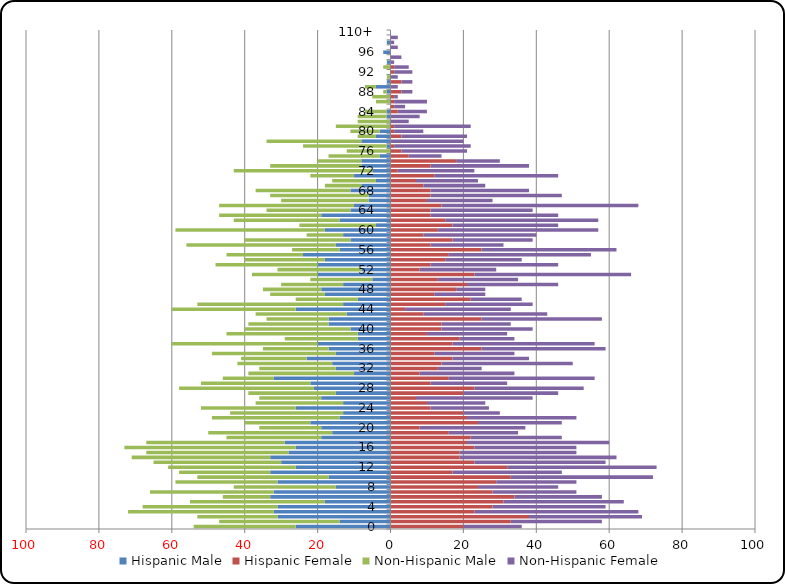
| Category | Hispanic Male | Hispanic Female | Non-Hispanic Male | Non-Hispanic Female |
|---|---|---|---|---|
| 0 | -26 | 20 | -28 | 16 |
| 1 | -14 | 33 | -33 | 25 |
| 2 | -31 | 38 | -22 | 31 |
| 3 | -32 | 23 | -40 | 45 |
| 4 | -31 | 28 | -37 | 31 |
| 5 | -18 | 31 | -37 | 33 |
| 6 | -33 | 34 | -13 | 24 |
| 7 | -32 | 28 | -34 | 23 |
| 8 | -15 | 24 | -28 | 22 |
| 9 | -31 | 29 | -28 | 22 |
| 10 | -17 | 33 | -36 | 39 |
| 11 | -33 | 17 | -25 | 30 |
| 12 | -26 | 32 | -35 | 41 |
| 13 | -30 | 23 | -35 | 36 |
| 14 | -33 | 19 | -38 | 43 |
| 15 | -28 | 19 | -39 | 32 |
| 16 | -26 | 23 | -47 | 28 |
| 17 | -29 | 21 | -38 | 39 |
| 18 | -19 | 22 | -26 | 25 |
| 19 | -16 | 16 | -34 | 19 |
| 20 | -19 | 8 | -17 | 29 |
| 21 | -22 | 24 | -18 | 23 |
| 22 | -14 | 21 | -35 | 30 |
| 23 | -13 | 20 | -31 | 10 |
| 24 | -26 | 11 | -26 | 16 |
| 25 | -13 | 10 | -24 | 16 |
| 26 | -19 | 7 | -17 | 32 |
| 27 | -15 | 20 | -24 | 26 |
| 28 | -21 | 23 | -37 | 30 |
| 29 | -22 | 11 | -30 | 21 |
| 30 | -32 | 16 | -14 | 40 |
| 31 | -10 | 8 | -29 | 26 |
| 32 | -15 | 13 | -21 | 12 |
| 33 | -16 | 14 | -26 | 36 |
| 34 | -23 | 17 | -18 | 21 |
| 35 | -15 | 12 | -34 | 22 |
| 36 | -17 | 25 | -18 | 34 |
| 37 | -20 | 17 | -40 | 39 |
| 38 | -9 | 19 | -20 | 15 |
| 39 | -9 | 10 | -36 | 22 |
| 40 | -11 | 14 | -29 | 25 |
| 41 | -17 | 14 | -22 | 19 |
| 42 | -17 | 25 | -17 | 33 |
| 43 | -12 | 9 | -25 | 34 |
| 44 | -26 | 4 | -34 | 29 |
| 45 | -13 | 15 | -40 | 24 |
| 46 | -9 | 22 | -17 | 14 |
| 47 | -18 | 12 | -15 | 14 |
| 48 | -19 | 18 | -16 | 8 |
| 49 | -13 | 21 | -17 | 25 |
| 50 | -5 | 13 | -17 | 22 |
| 51 | -20 | 23 | -18 | 43 |
| 52 | -8 | 8 | -23 | 21 |
| 53 | -20 | 11 | -28 | 35 |
| 54 | -18 | 15 | -22 | 21 |
| 55 | -24 | 16 | -21 | 39 |
| 56 | -14 | 25 | -13 | 37 |
| 57 | -15 | 11 | -41 | 20 |
| 58 | -11 | 17 | -29 | 22 |
| 59 | -13 | 9 | -10 | 31 |
| 60 | -18 | 13 | -41 | 44 |
| 61 | -4 | 17 | -21 | 29 |
| 62 | -14 | 15 | -29 | 42 |
| 63 | -19 | 11 | -28 | 35 |
| 64 | -11 | 11 | -23 | 28 |
| 65 | -10 | 14 | -37 | 54 |
| 66 | -6 | 10 | -24 | 18 |
| 67 | -6 | 11 | -27 | 36 |
| 68 | -11 | 11 | -26 | 27 |
| 69 | -8 | 9 | -10 | 17 |
| 70 | -4 | 7 | -12 | 17 |
| 71 | -10 | 12 | -12 | 34 |
| 72 | -5 | 2 | -38 | 21 |
| 73 | -8 | 11 | -25 | 27 |
| 74 | -8 | 18 | -12 | 12 |
| 75 | -3 | 5 | -14 | 9 |
| 76 | 0 | 3 | -12 | 18 |
| 77 | -1 | 1 | -23 | 21 |
| 78 | -8 | 0 | -26 | 20 |
| 79 | -4 | 3 | -5 | 18 |
| 80 | -3 | 1 | -8 | 8 |
| 81 | 0 | 1 | -15 | 21 |
| 82 | 0 | 0 | -9 | 5 |
| 83 | -1 | 0 | -8 | 8 |
| 84 | -1 | 2 | -6 | 8 |
| 85 | 0 | 1 | 0 | 3 |
| 86 | 0 | 1 | -4 | 9 |
| 87 | 0 | 1 | -5 | 1 |
| 88 | -1 | 3 | -1 | 3 |
| 89 | -4 | 0 | -3 | 2 |
| 90 | -1 | 3 | 0 | 3 |
| 91 | 0 | 0 | -1 | 2 |
| 92 | 0 | 1 | 0 | 5 |
| 93 | 0 | 1 | -2 | 4 |
| 94 | -1 | 0 | 0 | 1 |
| 95 | 0 | 0 | 0 | 3 |
| 96 | -2 | 0 | 0 | 0 |
| 97 | 0 | 0 | 0 | 2 |
| 98 | -1 | 0 | 0 | 1 |
| 99 | 0 | 0 | 0 | 2 |
| 110+ | 0 | 0 | 0 | 0 |